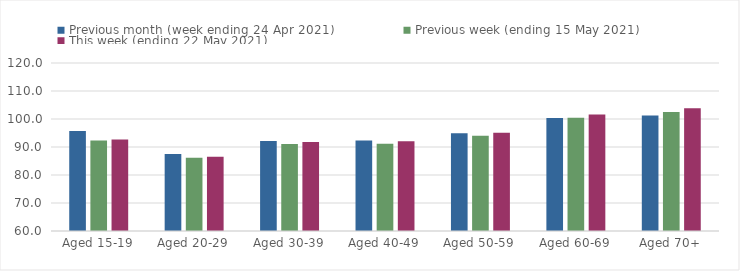
| Category | Previous month (week ending 24 Apr 2021) | Previous week (ending 15 May 2021) | This week (ending 22 May 2021) |
|---|---|---|---|
| Aged 15-19 | 95.73 | 92.36 | 92.68 |
| Aged 20-29 | 87.51 | 86.16 | 86.49 |
| Aged 30-39 | 92.12 | 91.07 | 91.79 |
| Aged 40-49 | 92.3 | 91.13 | 92.07 |
| Aged 50-59 | 94.95 | 94.06 | 95.05 |
| Aged 60-69 | 100.36 | 100.49 | 101.57 |
| Aged 70+ | 101.27 | 102.53 | 103.81 |